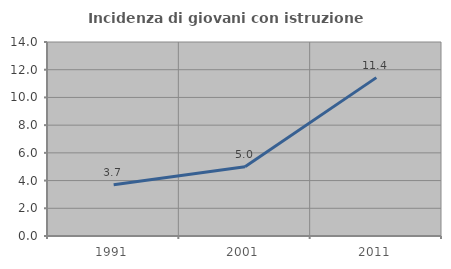
| Category | Incidenza di giovani con istruzione universitaria |
|---|---|
| 1991.0 | 3.704 |
| 2001.0 | 5 |
| 2011.0 | 11.429 |